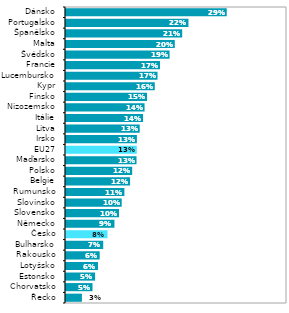
| Category | Series 1 |
|---|---|
| Řecko | 0.029 |
| Chorvatsko | 0.048 |
| Estonsko | 0.053 |
| Lotyšsko | 0.058 |
| Rakousko | 0.061 |
| Bulharsko | 0.067 |
| Česko | 0.075 |
| Německo | 0.088 |
| Slovensko | 0.096 |
| Slovinsko | 0.101 |
| Rumunsko | 0.106 |
| Belgie | 0.116 |
| Polsko | 0.12 |
| Maďarsko | 0.128 |
| EU27 | 0.128 |
| Irsko | 0.128 |
| Litva | 0.133 |
| Itálie | 0.139 |
| Nizozemsko | 0.142 |
| Finsko | 0.147 |
| Kypr | 0.161 |
| Lucembursko | 0.166 |
| Francie | 0.17 |
| Švédsko | 0.187 |
| Malta | 0.197 |
| Španělsko | 0.21 |
| Portugalsko | 0.222 |
| Dánsko | 0.291 |